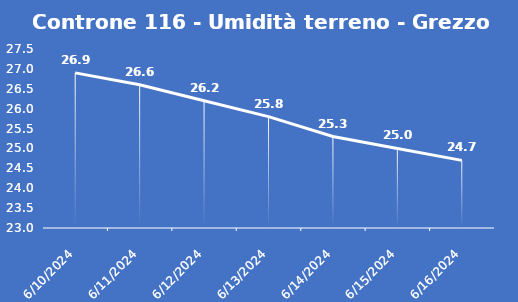
| Category | Controne 116 - Umidità terreno - Grezzo (%VWC) |
|---|---|
| 6/10/24 | 26.9 |
| 6/11/24 | 26.6 |
| 6/12/24 | 26.2 |
| 6/13/24 | 25.8 |
| 6/14/24 | 25.3 |
| 6/15/24 | 25 |
| 6/16/24 | 24.7 |